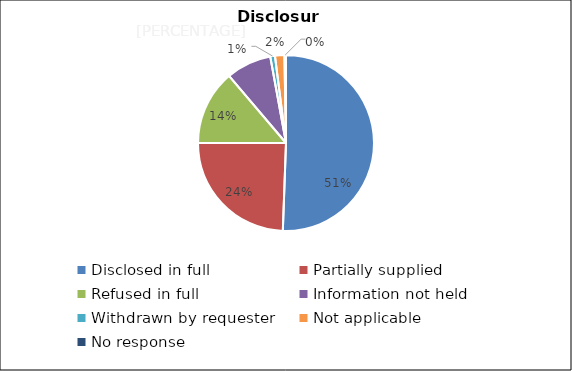
| Category | Series 0 |
|---|---|
| Disclosed in full | 176 |
| Partially supplied | 85 |
| Refused in full | 48 |
| Information not held | 29 |
| Withdrawn by requester | 3 |
| Not applicable | 6 |
| No response | 1 |